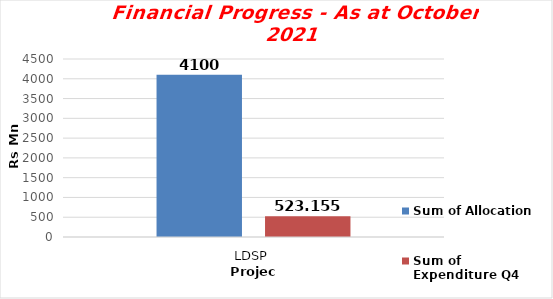
| Category | Sum of Allocation  | Sum of Expenditure Q4 |
|---|---|---|
| LDSP | 4100 | 523.155 |